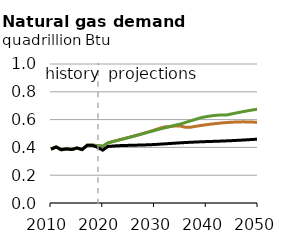
| Category | EAC | DAC | Reference |
|---|---|---|---|
| 2010.0 | 0.387 | 0.387 | 0.387 |
| 2011.0 | 0.403 | 0.403 | 0.403 |
| 2012.0 | 0.383 | 0.383 | 0.383 |
| 2013.0 | 0.389 | 0.389 | 0.389 |
| 2014.0 | 0.385 | 0.385 | 0.385 |
| 2015.0 | 0.396 | 0.396 | 0.396 |
| 2016.0 | 0.385 | 0.385 | 0.385 |
| 2017.0 | 0.415 | 0.415 | 0.415 |
| 2018.0 | 0.416 | 0.416 | 0.416 |
| 2019.0 | 0.413 | 0.413 | 0.4 |
| 2020.0 | 0.408 | 0.408 | 0.38 |
| 2021.0 | 0.433 | 0.432 | 0.407 |
| 2022.0 | 0.443 | 0.442 | 0.41 |
| 2023.0 | 0.453 | 0.452 | 0.412 |
| 2024.0 | 0.462 | 0.461 | 0.414 |
| 2025.0 | 0.472 | 0.471 | 0.415 |
| 2026.0 | 0.482 | 0.481 | 0.416 |
| 2027.0 | 0.492 | 0.491 | 0.417 |
| 2028.0 | 0.502 | 0.501 | 0.418 |
| 2029.0 | 0.514 | 0.512 | 0.419 |
| 2030.0 | 0.525 | 0.521 | 0.421 |
| 2031.0 | 0.537 | 0.532 | 0.423 |
| 2032.0 | 0.548 | 0.541 | 0.426 |
| 2033.0 | 0.549 | 0.551 | 0.428 |
| 2034.0 | 0.554 | 0.56 | 0.431 |
| 2035.0 | 0.554 | 0.568 | 0.433 |
| 2036.0 | 0.545 | 0.58 | 0.435 |
| 2037.0 | 0.545 | 0.591 | 0.437 |
| 2038.0 | 0.552 | 0.603 | 0.439 |
| 2039.0 | 0.558 | 0.614 | 0.44 |
| 2040.0 | 0.563 | 0.621 | 0.442 |
| 2041.0 | 0.568 | 0.627 | 0.443 |
| 2042.0 | 0.572 | 0.631 | 0.444 |
| 2043.0 | 0.576 | 0.634 | 0.446 |
| 2044.0 | 0.579 | 0.634 | 0.447 |
| 2045.0 | 0.581 | 0.642 | 0.449 |
| 2046.0 | 0.583 | 0.649 | 0.451 |
| 2047.0 | 0.584 | 0.656 | 0.453 |
| 2048.0 | 0.584 | 0.663 | 0.455 |
| 2049.0 | 0.582 | 0.67 | 0.457 |
| 2050.0 | 0.579 | 0.675 | 0.459 |